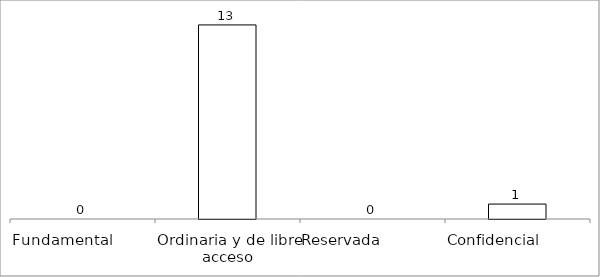
| Category | Series 0 |
|---|---|
| Fundamental         | 0 |
| Ordinaria y de libre acceso | 13 |
| Reservada               | 0 |
| Confidencial             | 1 |